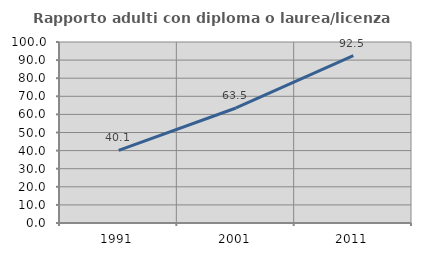
| Category | Rapporto adulti con diploma o laurea/licenza media  |
|---|---|
| 1991.0 | 40.124 |
| 2001.0 | 63.549 |
| 2011.0 | 92.486 |